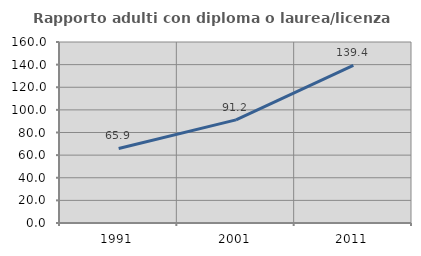
| Category | Rapporto adulti con diploma o laurea/licenza media  |
|---|---|
| 1991.0 | 65.916 |
| 2001.0 | 91.192 |
| 2011.0 | 139.368 |